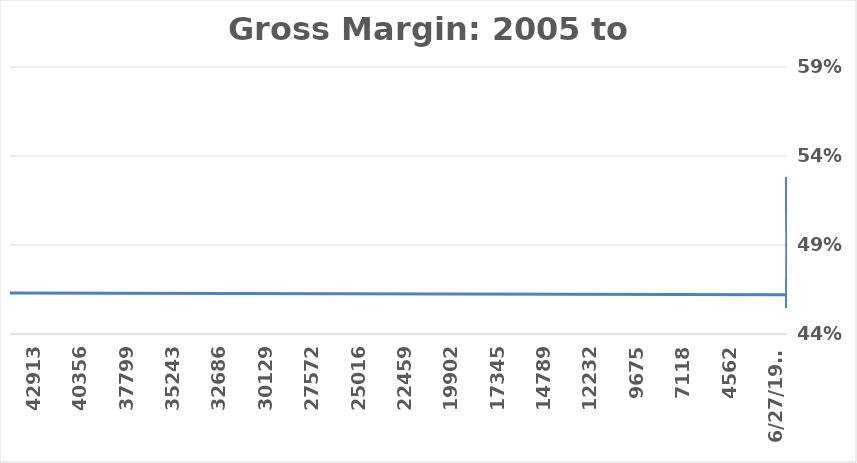
| Category | Gross margin |
|---|---|
| 9/30/22 | 0.463 |
| 7/13/05 | 0.462 |
| 7/12/05 | 0.455 |
| 7/11/05 | 0.472 |
| 7/10/05 | 0.483 |
| 7/9/05 | 0.493 |
| 7/8/05 | 0.496 |
| 7/7/05 | 0.504 |
| 7/6/05 | 0.508 |
| 7/5/05 | 0.517 |
| 7/4/05 | 0.515 |
| 7/3/05 | 0.518 |
| 7/2/05 | 0.518 |
| 7/1/05 | 0.509 |
| 6/30/05 | 0.528 |
| 6/29/05 | 0.508 |
| 6/28/05 | 0.502 |
| 6/27/05 | 0.498 |